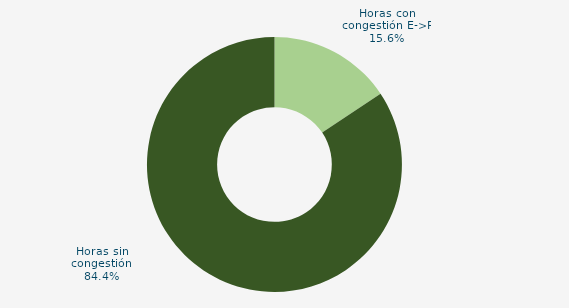
| Category | Horas con congestión E->P |
|---|---|
| Horas con congestión E->P | 15.625 |
| Horas con congestión P->E | 0 |
| Horas sin congestión | 84.375 |